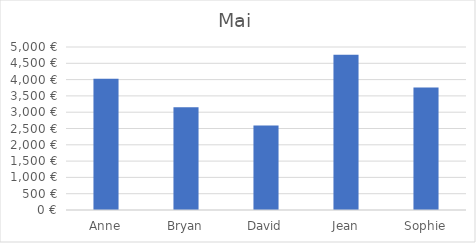
| Category | Mai |
|---|---|
| Anne | 4024 |
| Bryan | 3151 |
| David | 2595 |
| Jean | 4760 |
| Sophie | 3757 |